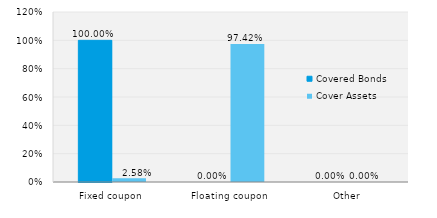
| Category | Covered Bonds | Cover Assets |
|---|---|---|
| Fixed coupon | 1 | 0.026 |
| Floating coupon | 0 | 0.974 |
| Other | 0 | 0 |